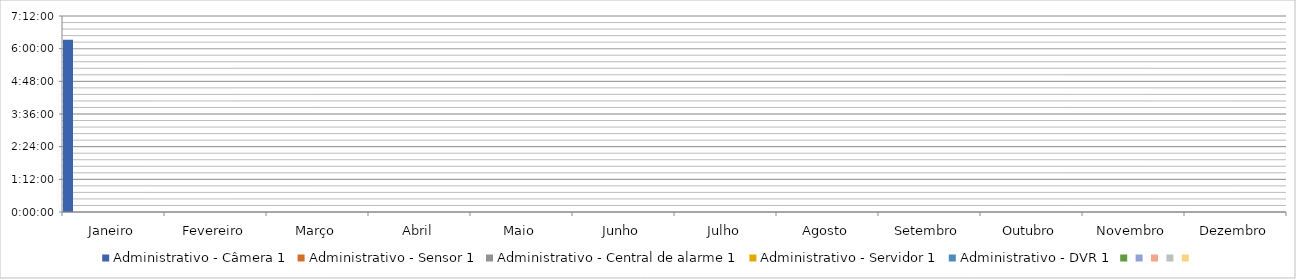
| Category | Administrativo - Câmera 1 | Administrativo - Sensor 1 | Administrativo - Central de alarme 1 | Administrativo - Servidor 1 | Administrativo - DVR 1 | Series 5 | Series 6 | Series 7 | Series 8 | Series 9 |
|---|---|---|---|---|---|---|---|---|---|---|
| Janeiro | 0.264 | 0 | 0 | 0 | 0 | 0 | 0 | 0 | 0 | 0 |
| Fevereiro | 0 | 0 | 0 | 0 | 0 | 0 | 0 | 0 | 0 | 0 |
| Março | 0 | 0 | 0 | 0 | 0 | 0 | 0 | 0 | 0 | 0 |
| Abril | 0 | 0 | 0 | 0 | 0 | 0 | 0 | 0 | 0 | 0 |
| Maio | 0 | 0 | 0 | 0 | 0 | 0 | 0 | 0 | 0 | 0 |
| Junho | 0 | 0 | 0 | 0 | 0 | 0 | 0 | 0 | 0 | 0 |
| Julho | 0 | 0 | 0 | 0 | 0 | 0 | 0 | 0 | 0 | 0 |
| Agosto | 0 | 0 | 0 | 0 | 0 | 0 | 0 | 0 | 0 | 0 |
| Setembro | 0 | 0 | 0 | 0 | 0 | 0 | 0 | 0 | 0 | 0 |
| Outubro | 0 | 0 | 0 | 0 | 0 | 0 | 0 | 0 | 0 | 0 |
| Novembro | 0 | 0 | 0 | 0 | 0 | 0 | 0 | 0 | 0 | 0 |
| Dezembro | 0 | 0 | 0 | 0 | 0 | 0 | 0 | 0 | 0 | 0 |